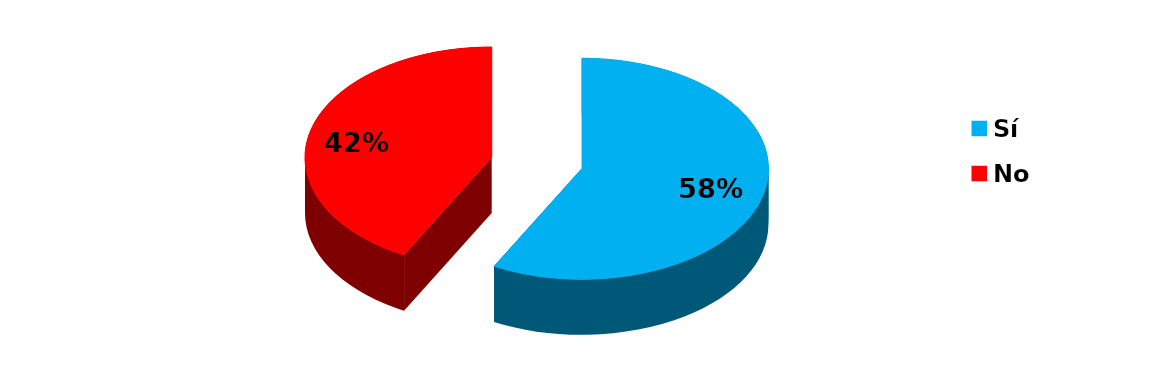
| Category | Series 0 |
|---|---|
| Sí | 26 |
| No | 19 |